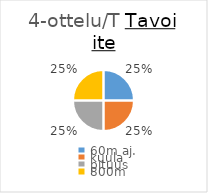
| Category | Series 0 |
|---|---|
| 60m aj. | 1000 |
| kuula | 1000 |
| pituus | 1000 |
| 800m | 1000 |